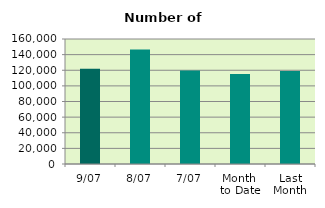
| Category | Series 0 |
|---|---|
| 9/07 | 121794 |
| 8/07 | 146428 |
| 7/07 | 119586 |
| Month 
to Date | 115062 |
| Last
Month | 119107.818 |